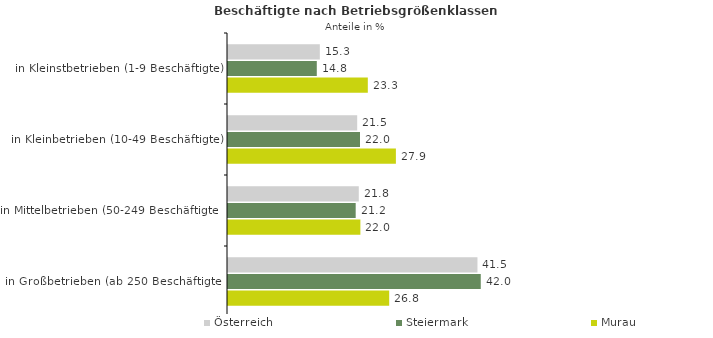
| Category | Österreich | Steiermark | Murau |
|---|---|---|---|
| in Kleinstbetrieben (1-9 Beschäftigte) | 15.273 | 14.768 | 23.253 |
| in Kleinbetrieben (10-49 Beschäftigte) | 21.487 | 21.955 | 27.924 |
| in Mittelbetrieben (50-249 Beschäftigte) | 21.75 | 21.237 | 22.018 |
| in Großbetrieben (ab 250 Beschäftigte) | 41.489 | 42.04 | 26.81 |